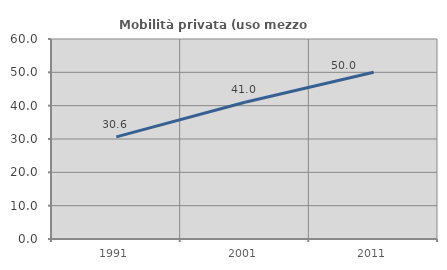
| Category | Mobilità privata (uso mezzo privato) |
|---|---|
| 1991.0 | 30.643 |
| 2001.0 | 41.026 |
| 2011.0 | 50 |